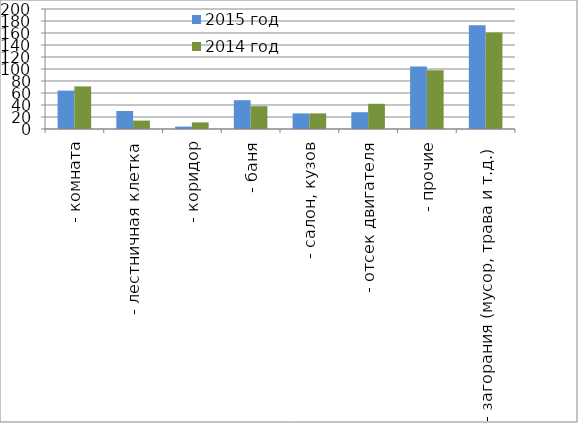
| Category | 2015 год | 2014 год |
|---|---|---|
|  - комната | 64 | 71 |
|  - лестничная клетка | 30 | 14 |
|  - коридор | 4 | 11 |
|  - баня | 48 | 38 |
|  - салон, кузов | 26 | 26 |
|  - отсек двигателя | 28 | 42 |
| - прочие | 104 | 98 |
| - загорания (мусор, трава и т.д.)  | 173 | 161 |